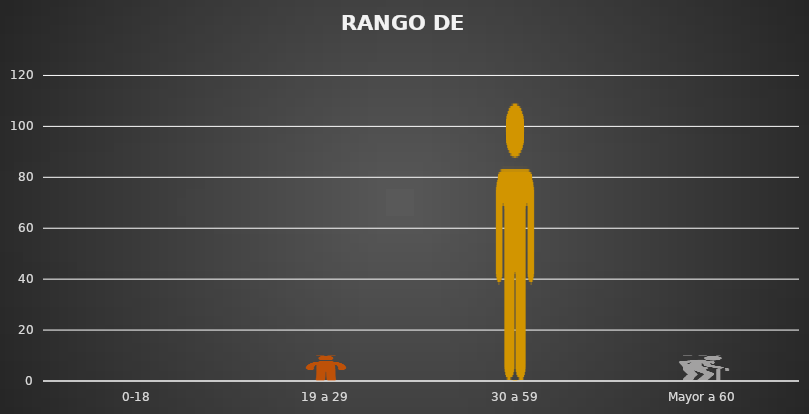
| Category | PARTICIPANTES |
|---|---|
| 0-18 | 0 |
| 19 a 29 | 10 |
| 30 a 59 | 109 |
| Mayor a 60 | 10 |